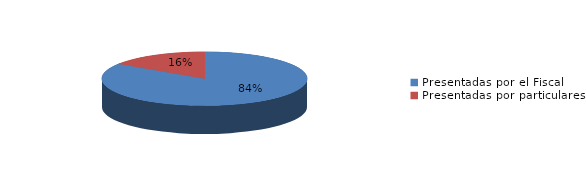
| Category | Series 0 |
|---|---|
| Presentadas por el Fiscal | 267 |
| Presentadas por particulares | 50 |